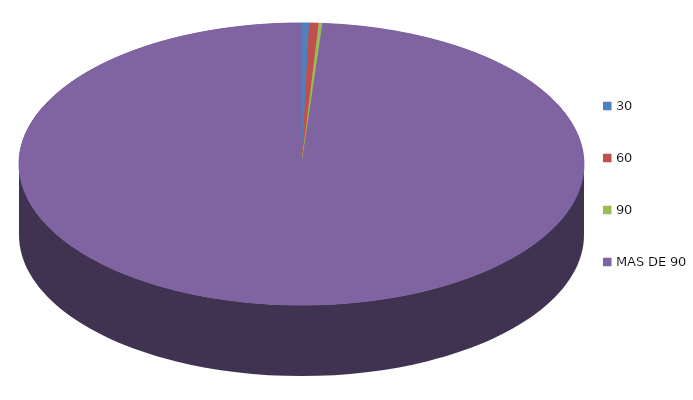
| Category | Series 0 | 179,417.1 |
|---|---|---|
| 0 | 179417.1 |  |
| 1 | 227270.9 |  |
| 2 | 90982.7 |  |
| 3 | 41637034.8 |  |